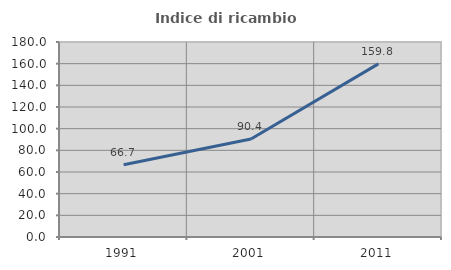
| Category | Indice di ricambio occupazionale  |
|---|---|
| 1991.0 | 66.667 |
| 2001.0 | 90.435 |
| 2011.0 | 159.794 |